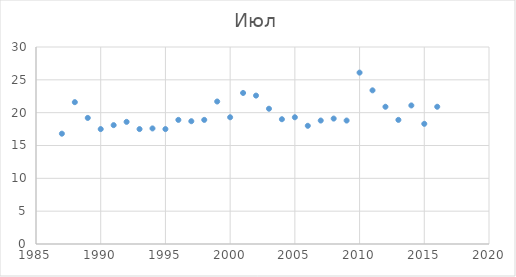
| Category | Июл |
|---|---|
| 1987.0 | 16.8 |
| 1988.0 | 21.6 |
| 1989.0 | 19.2 |
| 1990.0 | 17.5 |
| 1991.0 | 18.1 |
| 1992.0 | 18.6 |
| 1993.0 | 17.5 |
| 1994.0 | 17.6 |
| 1995.0 | 17.5 |
| 1996.0 | 18.9 |
| 1997.0 | 18.7 |
| 1998.0 | 18.9 |
| 1999.0 | 21.7 |
| 2000.0 | 19.3 |
| 2001.0 | 23 |
| 2002.0 | 22.6 |
| 2003.0 | 20.6 |
| 2004.0 | 19 |
| 2005.0 | 19.3 |
| 2006.0 | 18 |
| 2007.0 | 18.8 |
| 2008.0 | 19.1 |
| 2009.0 | 18.8 |
| 2010.0 | 26.1 |
| 2011.0 | 23.4 |
| 2012.0 | 20.9 |
| 2013.0 | 18.9 |
| 2014.0 | 21.1 |
| 2015.0 | 18.3 |
| 2016.0 | 20.9 |